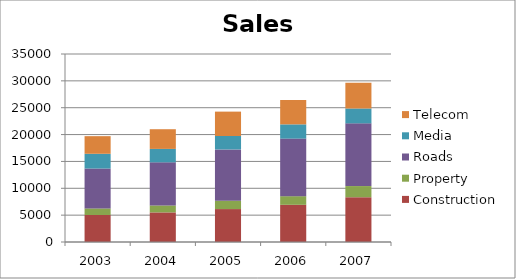
| Category | Construction | Property | Roads | Media | Telecom |
|---|---|---|---|---|---|
| 2003.0 | 5022 | 1230 | 7426 | 2743 | 3283 |
| 2004.0 | 5511 | 1295 | 8024 | 2502 | 3665 |
| 2005.0 | 6131 | 1557 | 9540 | 2508 | 4537 |
| 2006.0 | 6923 | 1608 | 10716 | 2654 | 4539 |
| 2007.0 | 8340 | 2075 | 11673 | 2764 | 4796 |